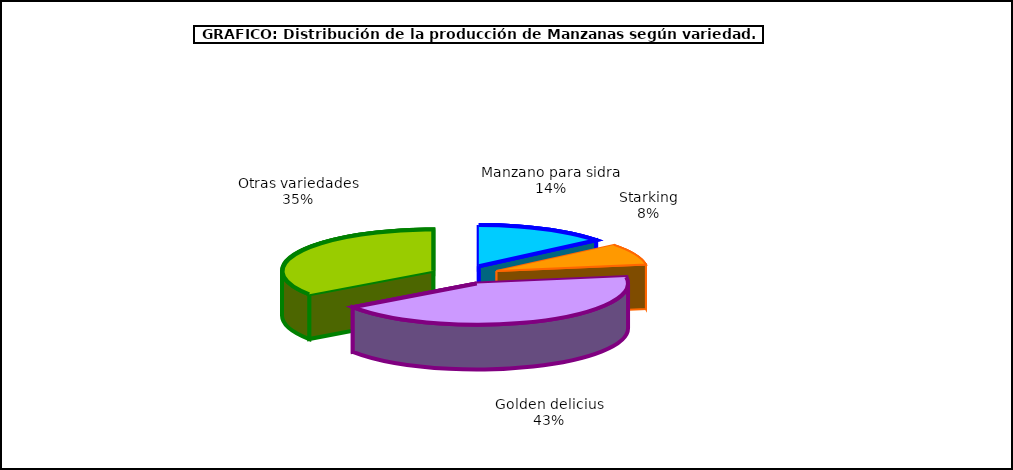
| Category | produccion |
|---|---|
| 0 | 84.483 |
| 1 | 50.082 |
| 2 | 256.078 |
| 3 | 207.564 |